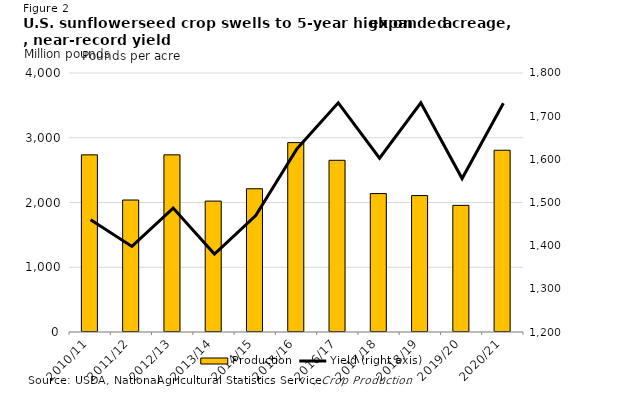
| Category | Production |
|---|---|
| 2010/11 | 2735.57 |
| 2011/12 | 2038.275 |
| 2012/13 | 2736.06 |
| 2013/14 | 2021.765 |
| 2014/15 | 2212.35 |
| 2015/16 | 2925.03 |
| 2016/17 | 2651.635 |
| 2017/18 | 2137.75 |
| 2018/19 | 2107.045 |
| 2019/20 | 1956.035 |
| 2020/21 | 2807.115 |